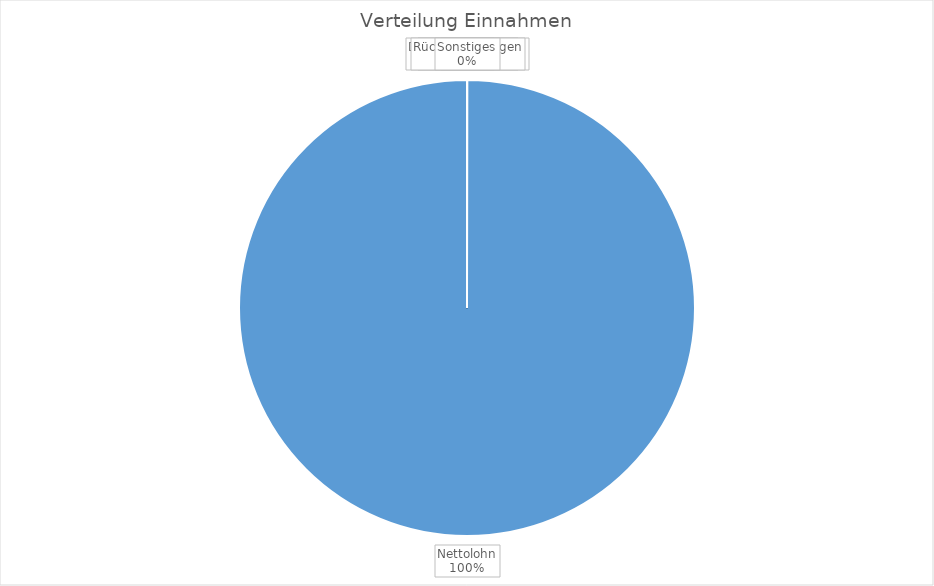
| Category | Summe |
|---|---|
| Nettolohn | 3500 |
| Dividenden, Zinsen | 0 |
| Mieteinnahmen | 0 |
| Verkauf | 0 |
| Rückerstattungen | 0 |
| Sonstiges | 0 |